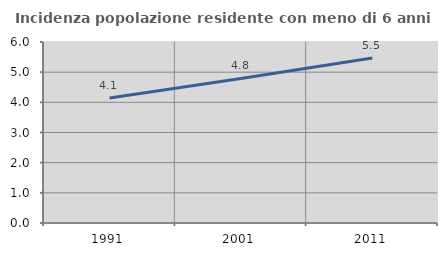
| Category | Incidenza popolazione residente con meno di 6 anni |
|---|---|
| 1991.0 | 4.145 |
| 2001.0 | 4.79 |
| 2011.0 | 5.468 |